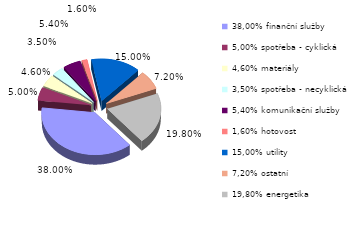
| Category | Series 0 |
|---|---|
| 38,00% finanční služby | 0.38 |
| 5,00% spotřeba - cyklická | 0.05 |
| 4,60% materiály | 0.046 |
| 3,50% spotřeba - necyklická | 0.035 |
| 5,40% komunikační služby | 0.054 |
| 1,60% hotovost | 0.016 |
| 15,00% utility | 0.15 |
| 7,20% ostatní | 0.072 |
| 19,80% energetika | 0.198 |